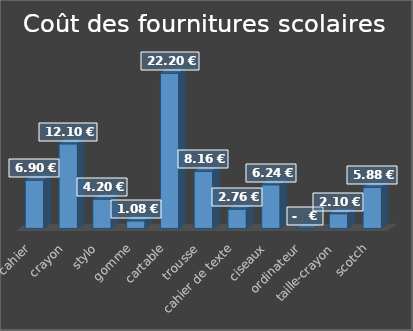
| Category | Series 0 |
|---|---|
| cahier | 6.9 |
| crayon | 12.096 |
| stylo | 4.2 |
| gomme | 1.08 |
| cartable | 22.2 |
| trousse | 8.16 |
| cahier de texte | 2.76 |
| ciseaux | 6.24 |
| ordinateur | 0 |
| taille-crayon | 2.1 |
| scotch | 5.88 |